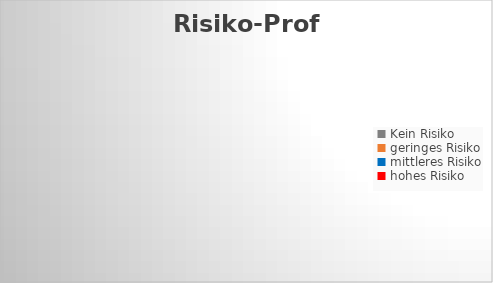
| Category | Series 0 |
|---|---|
| Kein Risiko | 0 |
| geringes Risiko | 0 |
| mittleres Risiko | 0 |
| hohes Risiko | 0 |